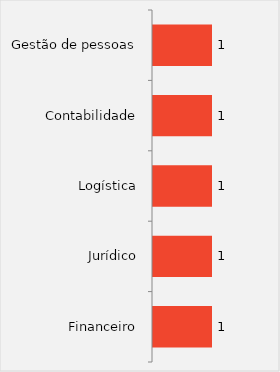
| Category | Series 0 |
|---|---|
| Financeiro | 1 |
| Jurídico | 1 |
| Logística | 1 |
| Contabilidade | 1 |
| Gestão de pessoas | 1 |